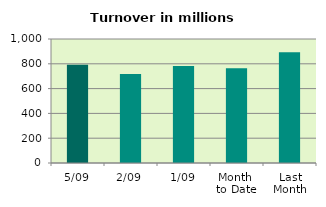
| Category | Series 0 |
|---|---|
| 5/09 | 792.645 |
| 2/09 | 717.565 |
| 1/09 | 782.385 |
| Month 
to Date | 764.198 |
| Last
Month | 893.956 |